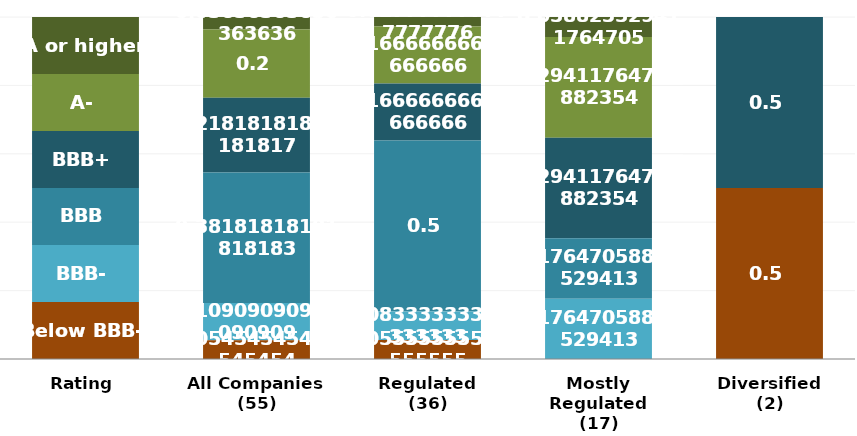
| Category | A or higher | A- | BBB+ | BBB | BBB- | Below BBB- |
|---|---|---|---|---|---|---|
| Rating | 1 | 1 | 1 | 1 | 1 | 1 |
| All Companies
(55) | 2 | 11 | 12 | 21 | 6 | 3 |
| Regulated
(36) | 1 | 6 | 6 | 18 | 3 | 2 |
| Mostly Regulated
(17) | 1 | 5 | 5 | 3 | 3 | 0 |
| Diversified
(2) | 0 | 0 | 1 | 0 | 0 | 1 |